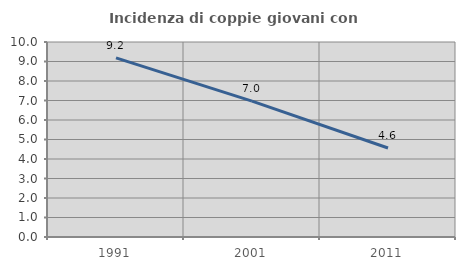
| Category | Incidenza di coppie giovani con figli |
|---|---|
| 1991.0 | 9.186 |
| 2001.0 | 6.971 |
| 2011.0 | 4.565 |